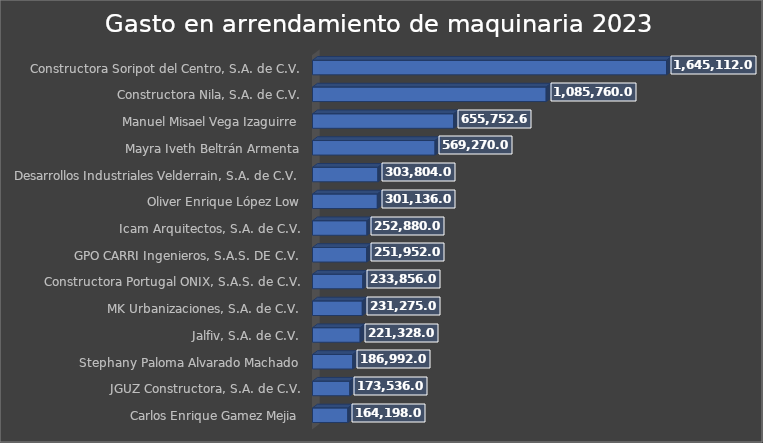
| Category | Suma |
|---|---|
| Carlos Enrique Gamez Mejia | 164198 |
| JGUZ Constructora, S.A. de C.V. | 173536 |
| Stephany Paloma Alvarado Machado | 186992 |
| Jalfiv, S.A. de C.V. | 221328 |
| MK Urbanizaciones, S.A. de C.V. | 231275 |
| Constructora Portugal ONIX, S.A.S. de C.V. | 233856 |
| GPO CARRI Ingenieros, S.A.S. DE C.V. | 251952 |
| Icam Arquitectos, S.A. de C.V. | 252880 |
| Oliver Enrique López Low | 301136 |
| Desarrollos Industriales Velderrain, S.A. de C.V. | 303804 |
| Mayra Iveth Beltrán Armenta | 569270 |
| Manuel Misael Vega Izaguirre | 655752.64 |
| Constructora Nila, S.A. de C.V. | 1085760 |
| Constructora Soripot del Centro, S.A. de C.V. | 1645112 |